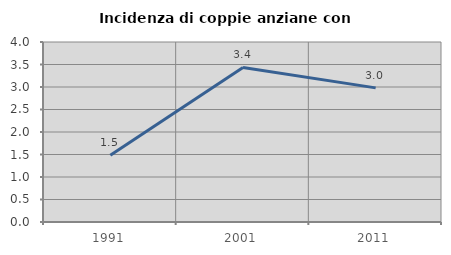
| Category | Incidenza di coppie anziane con figli |
|---|---|
| 1991.0 | 1.481 |
| 2001.0 | 3.436 |
| 2011.0 | 2.981 |